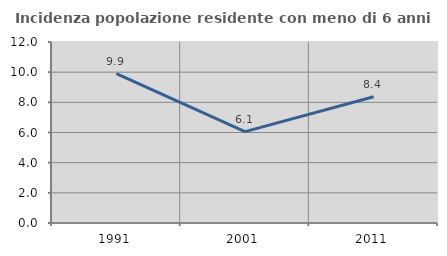
| Category | Incidenza popolazione residente con meno di 6 anni |
|---|---|
| 1991.0 | 9.901 |
| 2001.0 | 6.057 |
| 2011.0 | 8.366 |